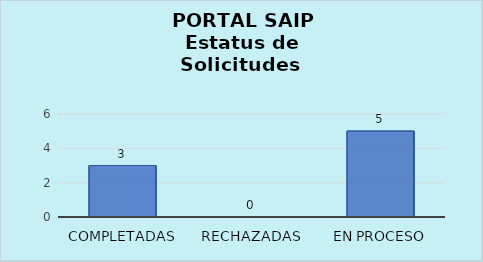
| Category | Series 0 |
|---|---|
| Completadas | 3 |
| Rechazadas | 0 |
| En Proceso | 5 |